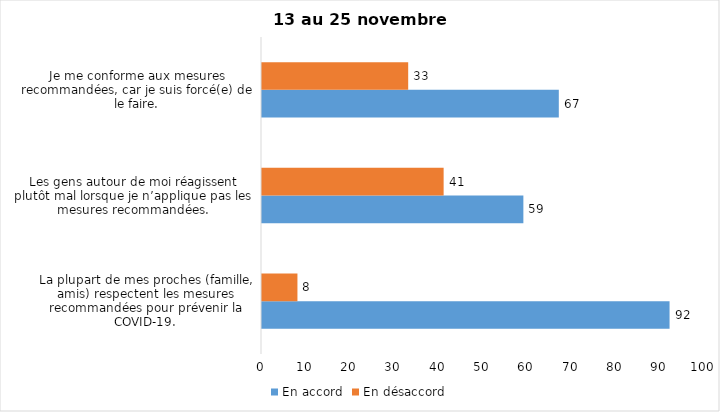
| Category | En accord | En désaccord |
|---|---|---|
| La plupart de mes proches (famille, amis) respectent les mesures recommandées pour prévenir la COVID-19. | 92 | 8 |
| Les gens autour de moi réagissent plutôt mal lorsque je n’applique pas les mesures recommandées. | 59 | 41 |
| Je me conforme aux mesures recommandées, car je suis forcé(e) de le faire. | 67 | 33 |